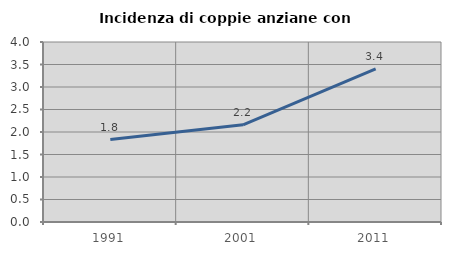
| Category | Incidenza di coppie anziane con figli |
|---|---|
| 1991.0 | 1.833 |
| 2001.0 | 2.16 |
| 2011.0 | 3.4 |